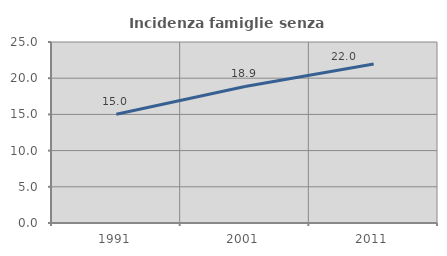
| Category | Incidenza famiglie senza nuclei |
|---|---|
| 1991.0 | 15.033 |
| 2001.0 | 18.866 |
| 2011.0 | 21.963 |